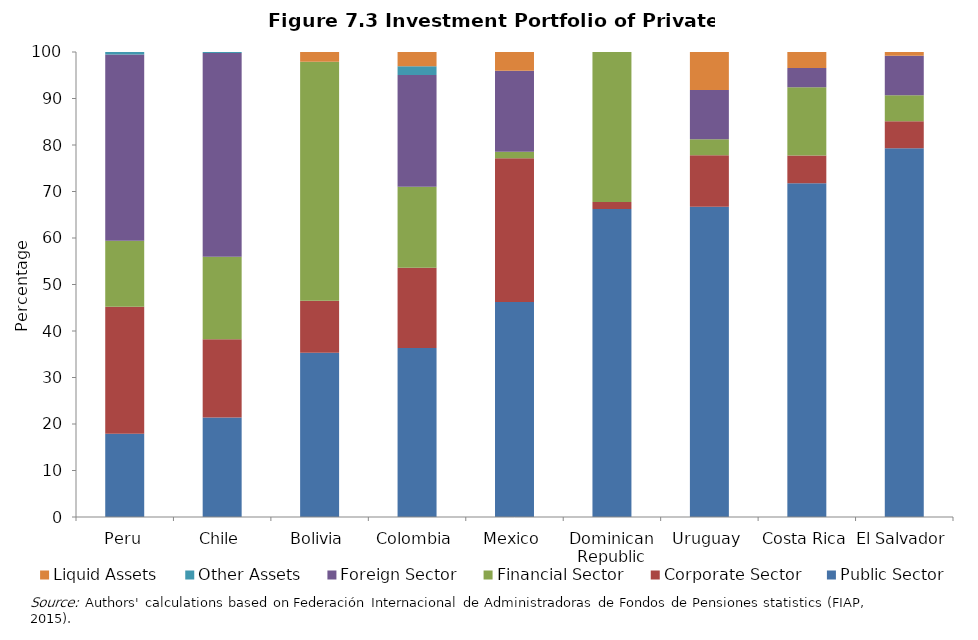
| Category | Public Sector | Corporate Sector | Financial Sector | Foreign Sector | Other Assets | Liquid Assets |
|---|---|---|---|---|---|---|
| Peru | 17.888 | 27.34 | 14.179 | 40.054 | 0.54 | 0 |
| Chile | 21.384 | 16.835 | 17.761 | 43.825 | 0.196 | 0 |
| Bolivia | 35.309 | 11.192 | 51.38 | 0 | 0 | 2.119 |
| Colombia | 36.319 | 17.296 | 17.398 | 24.032 | 1.912 | 3.043 |
| Mexico | 46.216 | 30.918 | 1.394 | 17.418 | 0 | 4.054 |
| Dominican Republic | 66.215 | 1.542 | 32.243 | 0 | 0 | 0 |
| Uruguay | 66.722 | 11.091 | 3.421 | 10.582 | 0 | 8.183 |
| Costa Rica | 71.775 | 5.991 | 14.654 | 4.138 | 0 | 3.443 |
| El Salvador | 79.322 | 5.776 | 5.59 | 8.512 | 0 | 0.8 |